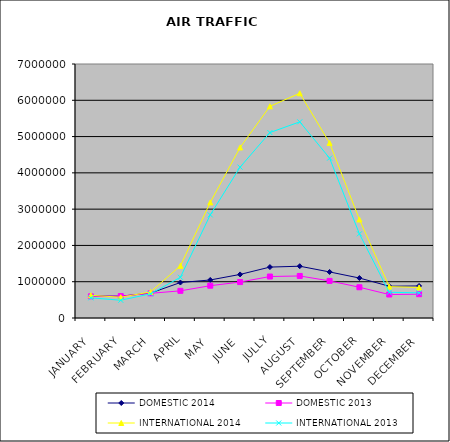
| Category | DOMESTIC 2014 | DOMESTIC 2013 | INTERNATIONAL 2014 | INTERNATIONAL 2013 |
|---|---|---|---|---|
| JANUARY | 605894 | 596670 | 625045 | 555838 |
| FEBRUARY | 601285 | 603615 | 571905 | 489189 |
| MARCH | 686964 | 680181 | 719389 | 664953 |
| APRIL | 977628 | 748586 | 1438399 | 1122274 |
| MAY | 1048085 | 890122 | 3185210 | 2841671 |
| JUNE | 1200545 | 990205 | 4699237 | 4157581 |
| JULLY | 1403252 | 1143141 | 5832928 | 5109571 |
| AUGUST | 1427189 | 1158675 | 6193839 | 5405505 |
| SEPTEMBER | 1269365 | 1023001 | 4823076 | 4405983 |
| OCTOBER | 1101704 | 847264 | 2715213 | 2319025 |
| NOVEMBER | 875238 | 646811 | 864810 | 708671 |
| DECEMBER | 883832 | 655474 | 842242 | 693335 |